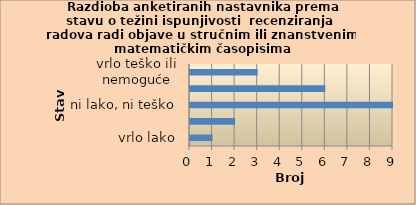
| Category | Series 0 |
|---|---|
| vrlo lako | 1 |
| lako | 2 |
| ni lako, ni teško | 9 |
| teško | 6 |
| vrlo teško ili nemoguće | 3 |